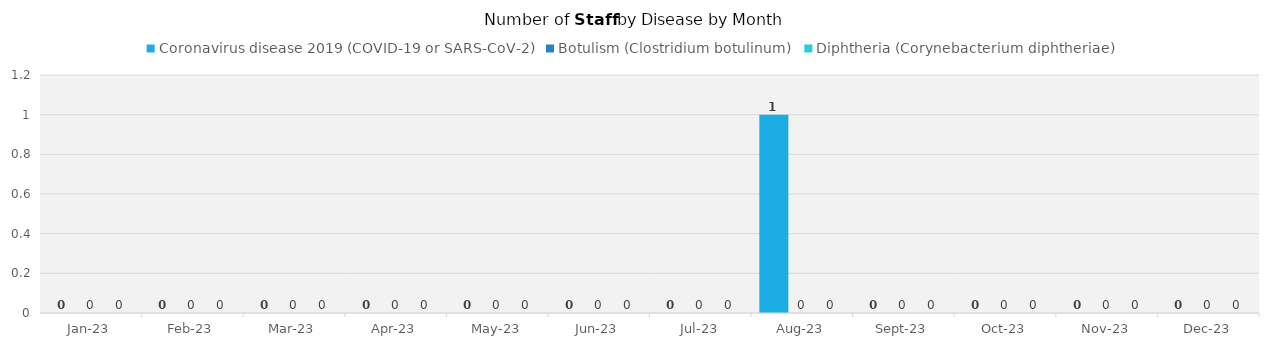
| Category | Coronavirus disease 2019 (COVID-19 or SARS-CoV-2)  | Botulism (Clostridium botulinum)  | Diphtheria (Corynebacterium diphtheriae)  |
|---|---|---|---|
| 2023-01-01 | 0 | 0 | 0 |
| 2023-02-01 | 0 | 0 | 0 |
| 2023-03-01 | 0 | 0 | 0 |
| 2023-04-01 | 0 | 0 | 0 |
| 2023-05-01 | 0 | 0 | 0 |
| 2023-06-01 | 0 | 0 | 0 |
| 2023-07-01 | 0 | 0 | 0 |
| 2023-08-01 | 1 | 0 | 0 |
| 2023-09-01 | 0 | 0 | 0 |
| 2023-10-01 | 0 | 0 | 0 |
| 2023-11-01 | 0 | 0 | 0 |
| 2023-12-01 | 0 | 0 | 0 |